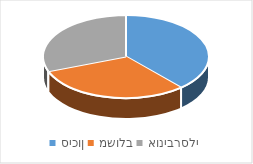
| Category | Series 0 |
|---|---|
| סיכון | 5 |
| משולב | 4 |
| אוניברסלי | 4 |